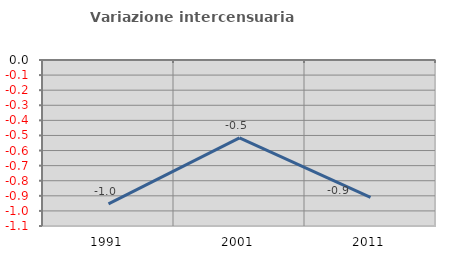
| Category | Variazione intercensuaria annua |
|---|---|
| 1991.0 | -0.953 |
| 2001.0 | -0.516 |
| 2011.0 | -0.91 |